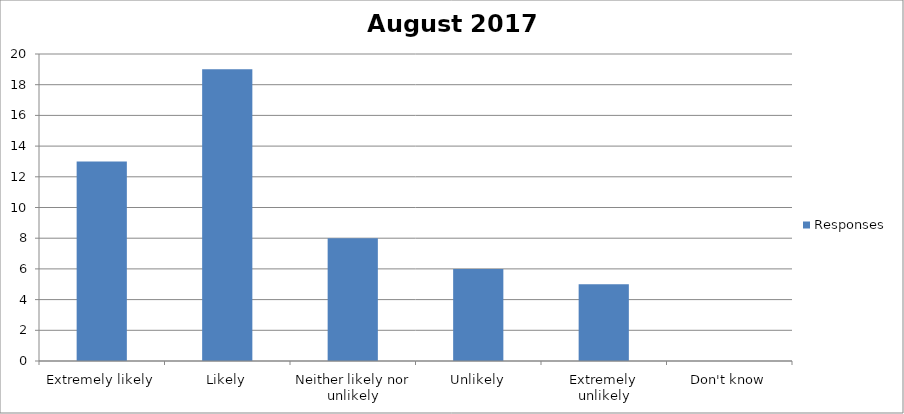
| Category | Responses |
|---|---|
| Extremely likely | 13 |
| Likely | 19 |
| Neither likely nor unlikely | 8 |
| Unlikely | 6 |
| Extremely unlikely | 5 |
| Don't know | 0 |